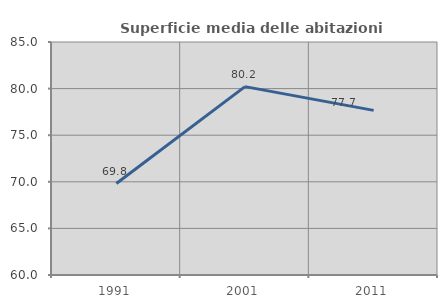
| Category | Superficie media delle abitazioni occupate |
|---|---|
| 1991.0 | 69.815 |
| 2001.0 | 80.212 |
| 2011.0 | 77.662 |